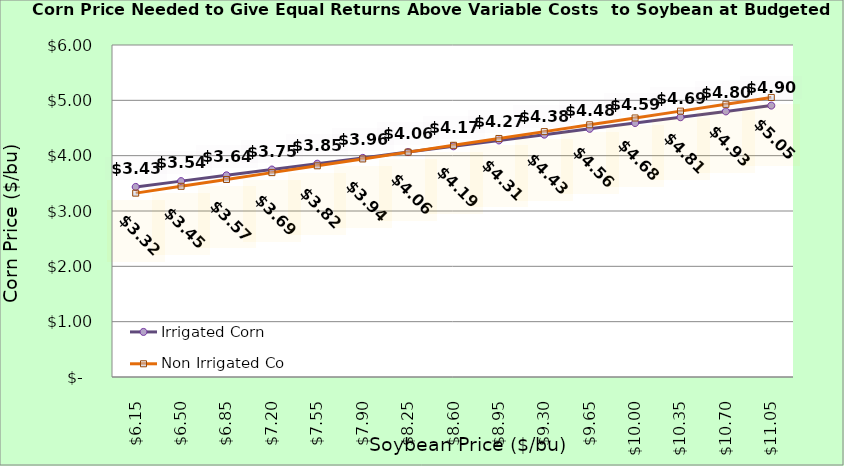
| Category | Irrigated Corn | Non Irrigated Corn |
|---|---|---|
| 6.150000000000002 | 3.435 | 3.323 |
| 6.500000000000002 | 3.54 | 3.446 |
| 6.850000000000001 | 3.645 | 3.57 |
| 7.200000000000001 | 3.75 | 3.693 |
| 7.550000000000001 | 3.855 | 3.817 |
| 7.9 | 3.96 | 3.94 |
| 8.25 | 4.065 | 4.064 |
| 8.6 | 4.17 | 4.187 |
| 8.95 | 4.275 | 4.311 |
| 9.299999999999999 | 4.38 | 4.435 |
| 9.649999999999999 | 4.485 | 4.558 |
| 9.999999999999998 | 4.59 | 4.682 |
| 10.349999999999998 | 4.695 | 4.805 |
| 10.699999999999998 | 4.8 | 4.929 |
| 11.049999999999997 | 4.905 | 5.052 |